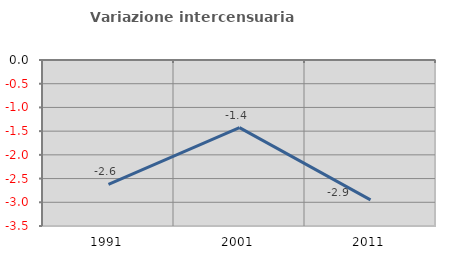
| Category | Variazione intercensuaria annua |
|---|---|
| 1991.0 | -2.622 |
| 2001.0 | -1.426 |
| 2011.0 | -2.949 |